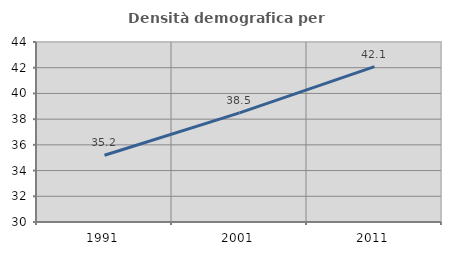
| Category | Densità demografica |
|---|---|
| 1991.0 | 35.189 |
| 2001.0 | 38.488 |
| 2011.0 | 42.087 |